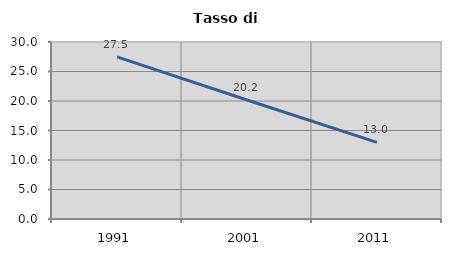
| Category | Tasso di disoccupazione   |
|---|---|
| 1991.0 | 27.477 |
| 2001.0 | 20.163 |
| 2011.0 | 12.989 |